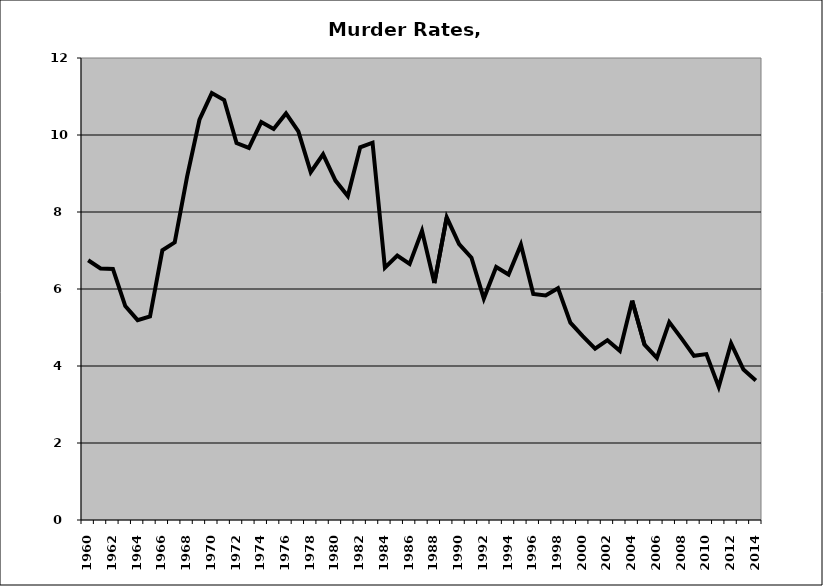
| Category | Murder |
|---|---|
| 1960.0 | 6.748 |
| 1961.0 | 6.534 |
| 1962.0 | 6.522 |
| 1963.0 | 5.557 |
| 1964.0 | 5.192 |
| 1965.0 | 5.285 |
| 1966.0 | 7.006 |
| 1967.0 | 7.212 |
| 1968.0 | 8.919 |
| 1969.0 | 10.396 |
| 1970.0 | 11.089 |
| 1971.0 | 10.908 |
| 1972.0 | 9.791 |
| 1973.0 | 9.665 |
| 1974.0 | 10.337 |
| 1975.0 | 10.159 |
| 1976.0 | 10.56 |
| 1977.0 | 10.093 |
| 1978.0 | 9.034 |
| 1979.0 | 9.498 |
| 1980.0 | 8.815 |
| 1981.0 | 8.413 |
| 1982.0 | 9.681 |
| 1983.0 | 9.801 |
| 1984.0 | 6.554 |
| 1985.0 | 6.871 |
| 1986.0 | 6.652 |
| 1987.0 | 7.513 |
| 1988.0 | 6.154 |
| 1989.0 | 7.862 |
| 1990.0 | 7.164 |
| 1991.0 | 6.814 |
| 1992.0 | 5.752 |
| 1993.0 | 6.572 |
| 1994.0 | 6.376 |
| 1995.0 | 7.15 |
| 1996.0 | 5.87 |
| 1997.0 | 5.834 |
| 1998.0 | 6.021 |
| 1999.0 | 5.125 |
| 2000.0 | 4.775 |
| 2001.0 | 4.448 |
| 2002.0 | 4.67 |
| 2003.0 | 4.395 |
| 2004.0 | 5.698 |
| 2005.0 | 4.554 |
| 2006.0 | 4.208 |
| 2007.0 | 5.14 |
| 2008.0 | 4.711 |
| 2009.0 | 4.265 |
| 2010.0 | 4.309 |
| 2011.0 | 3.458 |
| 2012.0 | 4.589 |
| 2013.0 | 3.909 |
| 2014.0 | 3.625 |